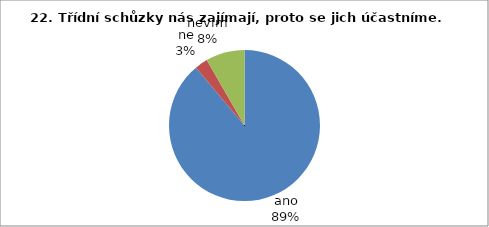
| Category | 22. Třídní schůzky nás zajímají, proto se jich účastníme. |
|---|---|
| ano | 32 |
| ne | 1 |
| nevím | 3 |